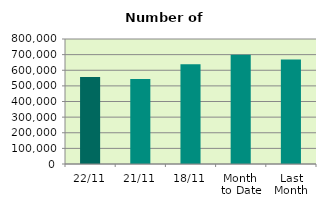
| Category | Series 0 |
|---|---|
| 22/11 | 556944 |
| 21/11 | 543632 |
| 18/11 | 637804 |
| Month 
to Date | 698860.25 |
| Last
Month | 669366.857 |